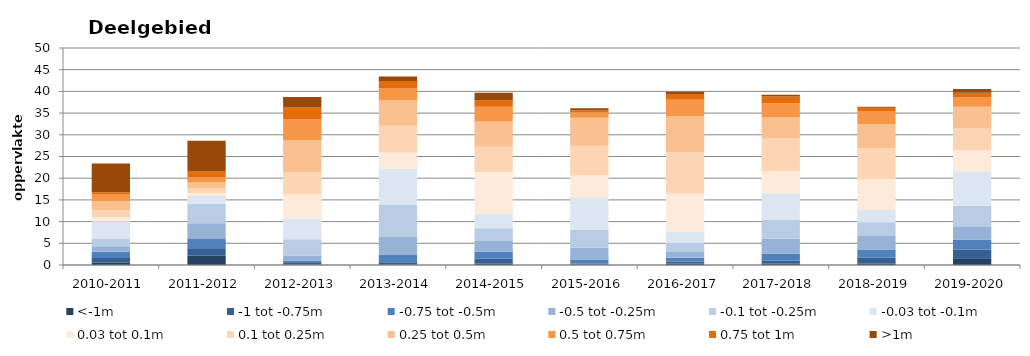
| Category | <-1m | -1 tot -0.75m | -0.75 tot -0.5m | -0.5 tot -0.25m | -0.1 tot -0.25m | -0.03 tot -0.1m | 0.03 tot 0.1m | 0.1 tot 0.25m | 0.25 tot 0.5m | 0.5 tot 0.75m | 0.75 tot 1m | >1m |
|---|---|---|---|---|---|---|---|---|---|---|---|---|
| 2010-2011 | 0.518 | 1.094 | 1.465 | 1.24 | 1.779 | 3.943 | 0.985 | 1.59 | 2.077 | 1.548 | 0.521 | 6.643 |
| 2011-2012 | 2.144 | 1.56 | 2.278 | 3.643 | 4.462 | 1.814 | 0.698 | 1.141 | 1.296 | 1.211 | 1.312 | 7.052 |
| 2012-2013 | 0.086 | 0.369 | 0.596 | 1.164 | 3.702 | 4.795 | 5.559 | 5.062 | 7.442 | 4.75 | 2.793 | 2.386 |
| 2013-2014 | 0.086 | 0.529 | 1.684 | 4.143 | 7.403 | 8.368 | 3.703 | 6.194 | 5.833 | 2.732 | 1.698 | 1.036 |
| 2014-2015 | 0.336 | 1.125 | 1.65 | 2.415 | 2.93 | 3.345 | 9.636 | 5.796 | 5.841 | 3.361 | 1.466 | 1.792 |
| 2015-2016 | 0.086 | 0.224 | 0.945 | 2.727 | 4.11 | 7.49 | 5.044 | 6.837 | 6.489 | 1.228 | 0.455 | 0.51 |
| 2016-2017 | 0.374 | 0.397 | 0.886 | 1.342 | 2.105 | 2.553 | 8.744 | 9.587 | 8.362 | 3.737 | 1.296 | 0.548 |
| 2017-2018 | 0.336 | 0.637 | 1.66 | 3.394 | 4.352 | 6.134 | 5.029 | 7.577 | 4.96 | 3.186 | 1.557 | 0.411 |
| 2018-2019 | 0.323 | 1.342 | 1.934 | 3.097 | 3.163 | 2.896 | 7.009 | 7.11 | 5.638 | 2.964 | 0.784 | 0.199 |
| 2019-2020 | 1.572 | 1.979 | 2.321 | 3.042 | 4.738 | 7.948 | 4.77 | 5.184 | 4.886 | 2.175 | 1.068 | 0.849 |